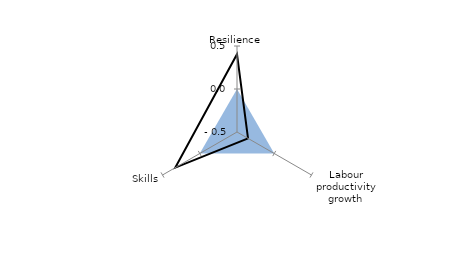
| Category | OECD average | Priority: LPg |
|---|---|---|
| Resilience | 0 | 0.404 |
| Labour productivity
growth | 0 | -0.352 |
| Skills | 0 | 0.328 |